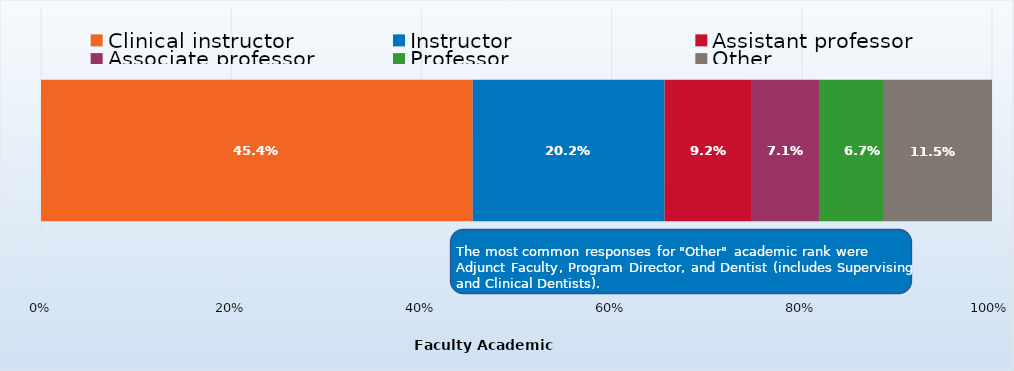
| Category | Clinical instructor | Instructor | Assistant professor | Associate professor | Professor | Other |
|---|---|---|---|---|---|---|
| 0 | 0.454 | 0.202 | 0.092 | 0.071 | 0.067 | 0.115 |